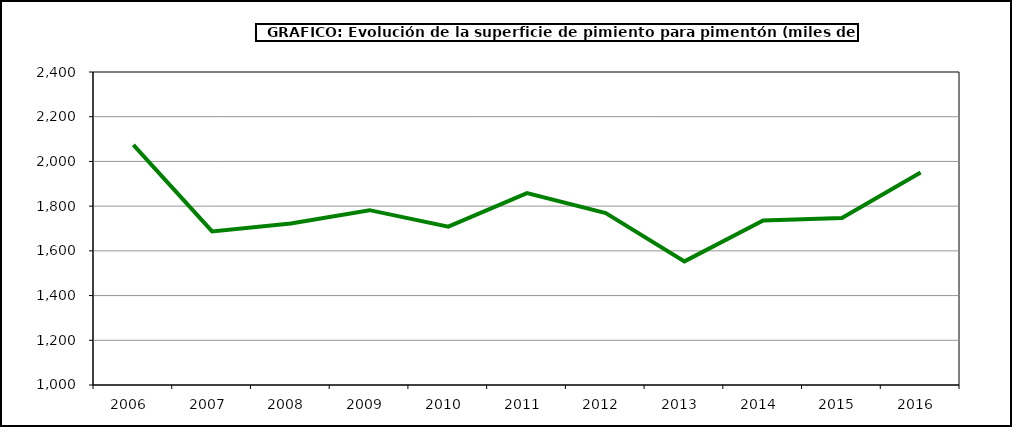
| Category | Superficie |
|---|---|
| 2006.0 | 2074 |
| 2007.0 | 1687 |
| 2008.0 | 1722 |
| 2009.0 | 1782 |
| 2010.0 | 1708 |
| 2011.0 | 1858 |
| 2012.0 | 1769 |
| 2013.0 | 1553 |
| 2014.0 | 1736 |
| 2015.0 | 1747 |
| 2016.0 | 1950 |